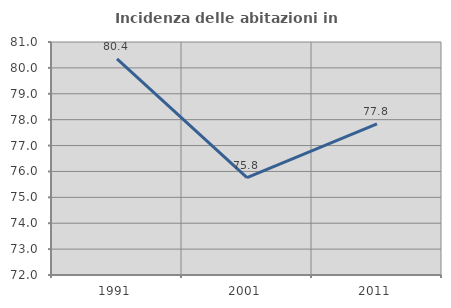
| Category | Incidenza delle abitazioni in proprietà  |
|---|---|
| 1991.0 | 80.35 |
| 2001.0 | 75.765 |
| 2011.0 | 77.84 |